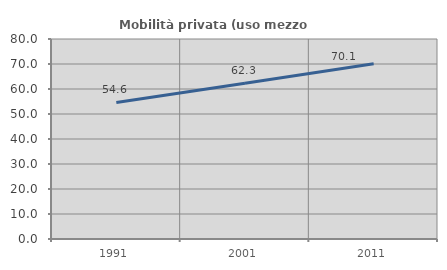
| Category | Mobilità privata (uso mezzo privato) |
|---|---|
| 1991.0 | 54.61 |
| 2001.0 | 62.34 |
| 2011.0 | 70.117 |